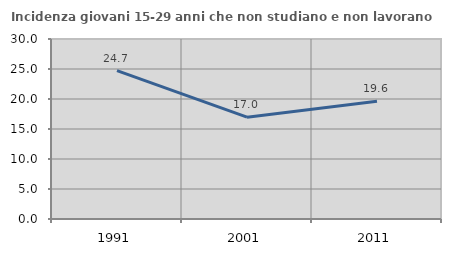
| Category | Incidenza giovani 15-29 anni che non studiano e non lavorano  |
|---|---|
| 1991.0 | 24.719 |
| 2001.0 | 16.97 |
| 2011.0 | 19.643 |